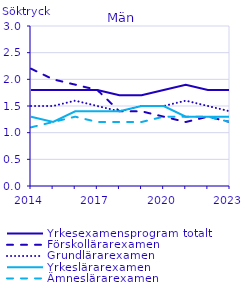
| Category | Yrkesexamensprogram totalt | Förskollärarexamen                                 | Grundlärarexamen                                   | Yrkeslärarexamen                                   | Ämneslärarexamen                                   |
|---|---|---|---|---|---|
| 2014.0 | 1.8 | 2.2 | 1.5 | 1.3 | 1.1 |
| 2015.0 | 1.8 | 2 | 1.5 | 1.2 | 1.2 |
| 2016.0 | 1.8 | 1.9 | 1.6 | 1.4 | 1.3 |
| 2017.0 | 1.8 | 1.8 | 1.5 | 1.4 | 1.2 |
| 2018.0 | 1.7 | 1.4 | 1.4 | 1.4 | 1.2 |
| 2019.0 | 1.7 | 1.4 | 1.5 | 1.5 | 1.2 |
| 2020.0 | 1.8 | 1.3 | 1.5 | 1.5 | 1.3 |
| 2021.0 | 1.9 | 1.2 | 1.6 | 1.3 | 1.3 |
| 2022.0 | 1.8 | 1.3 | 1.5 | 1.3 | 1.3 |
| 2023.0 | 1.8 | 1.2 | 1.4 | 1.3 | 1.2 |